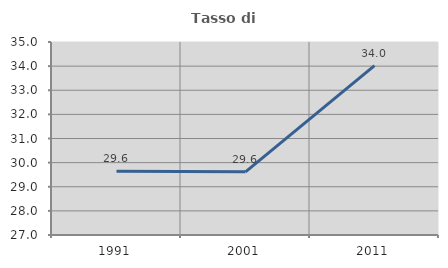
| Category | Tasso di occupazione   |
|---|---|
| 1991.0 | 29.638 |
| 2001.0 | 29.618 |
| 2011.0 | 34.021 |